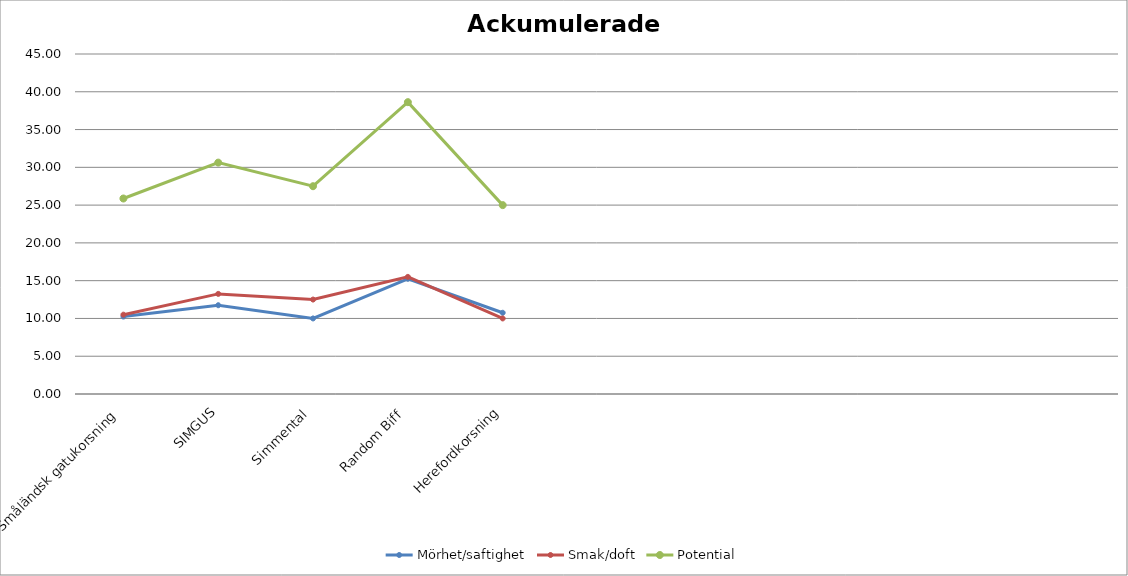
| Category | Mörhet/saftighet | Smak/doft | Potential |
|---|---|---|---|
| Småländsk gatukorsning | 10.25 | 10.5 | 25.875 |
| SIMGUS | 11.75 | 13.25 | 30.625 |
| Simmental | 10 | 12.5 | 27.5 |
| Random Biff | 15.25 | 15.5 | 38.625 |
| Herefordkorsning | 10.75 | 10 | 25 |